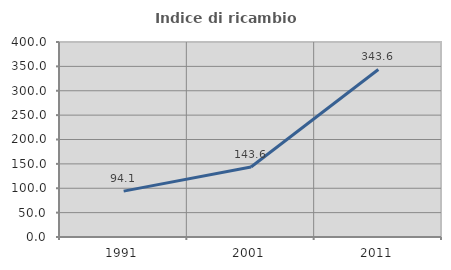
| Category | Indice di ricambio occupazionale  |
|---|---|
| 1991.0 | 94.148 |
| 2001.0 | 143.585 |
| 2011.0 | 343.641 |